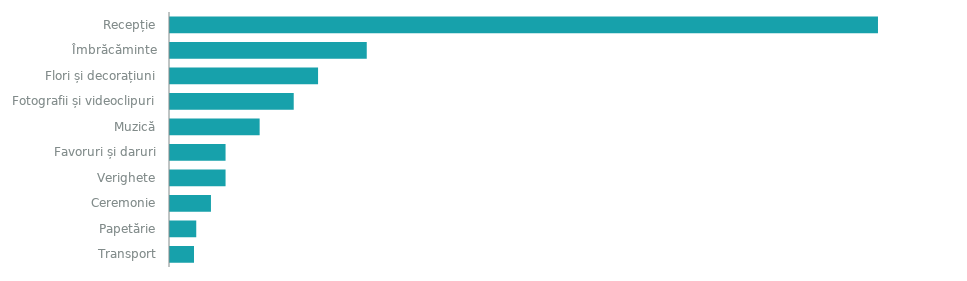
| Category | COSTUL ESTIMAT |
|---|---|
| Recepție | 14500 |
| Îmbrăcăminte | 4000 |
| Flori și decorațiuni | 3000 |
| Fotografii și videoclipuri | 2500 |
| Muzică | 1800 |
| Favoruri și daruri | 1100 |
| Verighete | 1100 |
| Ceremonie | 800 |
| Papetărie | 500 |
| Transport | 450 |